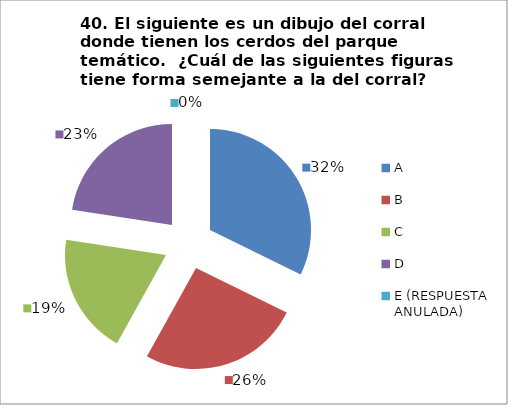
| Category | CANTIDAD DE RESPUESTAS PREGUNTA (40) | PORCENTAJE |
|---|---|---|
| A | 10 | 0.323 |
| B | 8 | 0.258 |
| C | 6 | 0.194 |
| D | 7 | 0.226 |
| E (RESPUESTA ANULADA) | 0 | 0 |